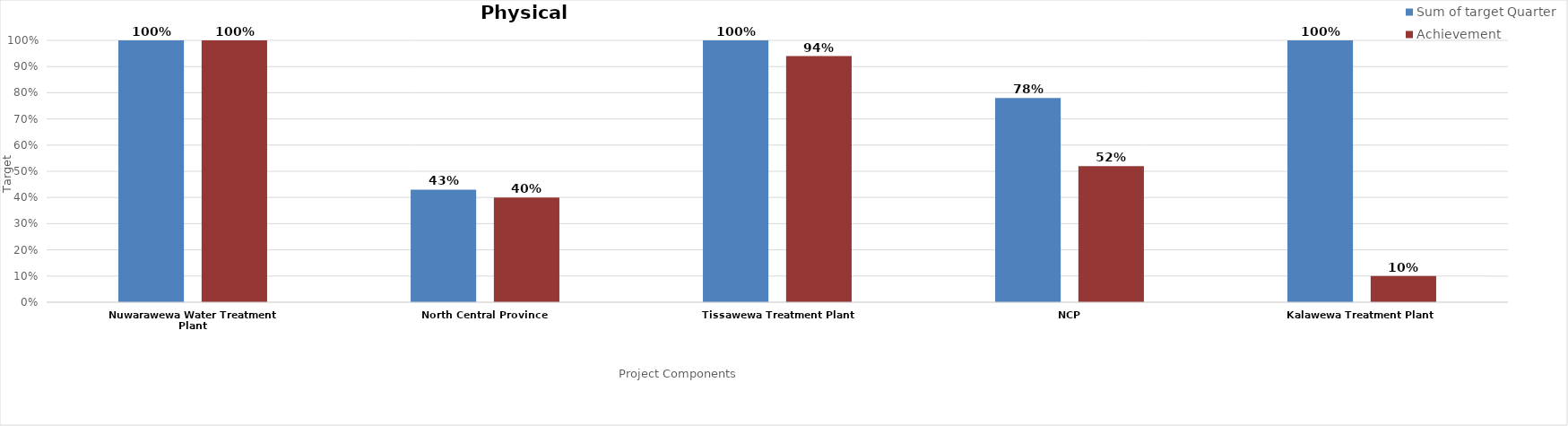
| Category | Sum of target Quarter | Achievement |
|---|---|---|
| Nuwarawewa Water Treatment Plant, North Central Province  | 1 | 1 |
|  Tissawewa Treatment Plant, NCP | 0.43 | 0.4 |
| Kalawewa Treatment Plant, NCP | 1 | 0.94 |
| Augmentation of Girandurukotte Treatment Plant - Civil Works | 0.78 | 0.52 |
| Augmentation of Girandurukotte Treatment Plant - Electrical  | 1 | 0.1 |